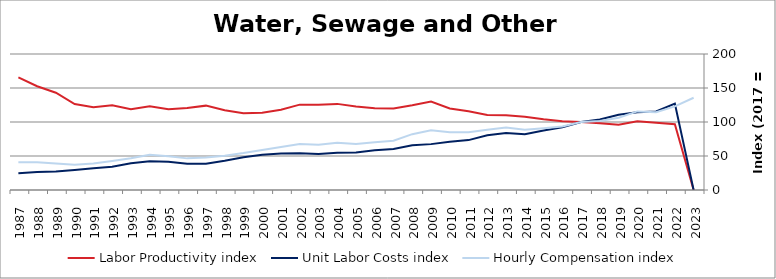
| Category | Labor Productivity index | Unit Labor Costs index | Hourly Compensation index |
|---|---|---|---|
| 2023.0 | 0 | 0 | 135.658 |
| 2022.0 | 96.724 | 127.093 | 122.929 |
| 2021.0 | 98.96 | 115.472 | 114.272 |
| 2020.0 | 100.972 | 114.475 | 115.588 |
| 2019.0 | 96.014 | 110.75 | 106.335 |
| 2018.0 | 97.991 | 103.629 | 101.547 |
| 2017.0 | 100 | 100 | 100 |
| 2016.0 | 101.241 | 92.255 | 93.4 |
| 2015.0 | 104.011 | 87.359 | 90.863 |
| 2014.0 | 107.873 | 82.023 | 88.48 |
| 2013.0 | 109.776 | 83.672 | 91.852 |
| 2012.0 | 110.396 | 80.369 | 88.725 |
| 2011.0 | 115.67 | 73.376 | 84.873 |
| 2010.0 | 119.896 | 70.816 | 84.906 |
| 2009.0 | 129.992 | 67.46 | 87.693 |
| 2008.0 | 124.594 | 65.918 | 82.13 |
| 2007.0 | 119.827 | 60.423 | 72.404 |
| 2006.0 | 120.118 | 58.393 | 70.14 |
| 2005.0 | 122.8 | 55.149 | 67.723 |
| 2004.0 | 126.65 | 54.839 | 69.453 |
| 2003.0 | 125.476 | 53.063 | 66.581 |
| 2002.0 | 125.509 | 53.89 | 67.637 |
| 2001.0 | 118.073 | 53.612 | 63.301 |
| 2000.0 | 113.644 | 51.665 | 58.714 |
| 1999.0 | 112.986 | 48.023 | 54.259 |
| 1998.0 | 117.352 | 42.993 | 50.453 |
| 1997.0 | 124.059 | 38.62 | 47.912 |
| 1996.0 | 120.594 | 38.571 | 46.514 |
| 1995.0 | 118.906 | 41.711 | 49.597 |
| 1994.0 | 123.107 | 42.125 | 51.859 |
| 1993.0 | 118.803 | 39.28 | 46.666 |
| 1992.0 | 124.774 | 34.118 | 42.57 |
| 1991.0 | 121.699 | 32.008 | 38.953 |
| 1990.0 | 126.44 | 29.434 | 37.216 |
| 1989.0 | 143.013 | 27.17 | 38.857 |
| 1988.0 | 152.646 | 26.648 | 40.677 |
| 1987.0 | 165.668 | 24.552 | 40.674 |